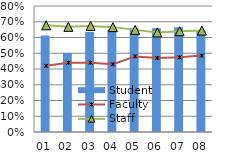
| Category | Student |
|---|---|
| 01 | 0.612 |
| 02 | 0.502 |
| 03 | 0.635 |
| 04 | 0.651 |
| 05 | 0.659 |
| 06 | 0.659 |
| 07 | 0.665 |
| 08 | 0.641 |